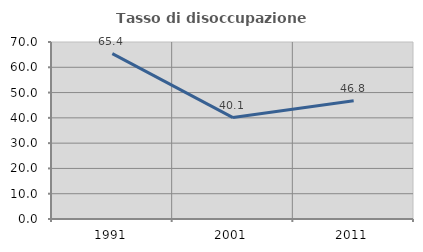
| Category | Tasso di disoccupazione giovanile  |
|---|---|
| 1991.0 | 65.421 |
| 2001.0 | 40.11 |
| 2011.0 | 46.789 |